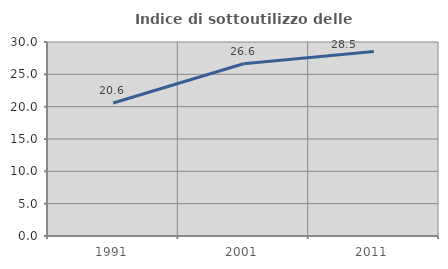
| Category | Indice di sottoutilizzo delle abitazioni  |
|---|---|
| 1991.0 | 20.576 |
| 2001.0 | 26.64 |
| 2011.0 | 28.526 |